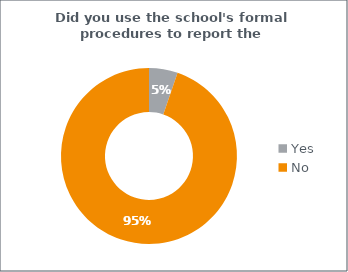
| Category | Percent |
|---|---|
| Yes | 0.053 |
| No | 0.947 |